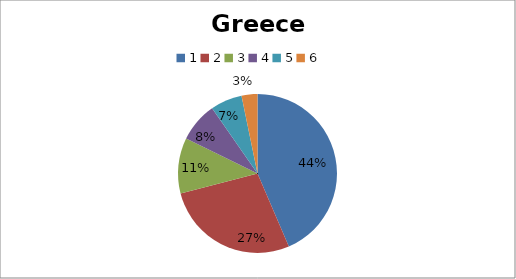
| Category | Greece |
|---|---|
| 0 | 27 |
| 1 | 17 |
| 2 | 7 |
| 3 | 5 |
| 4 | 4 |
| 5 | 2 |